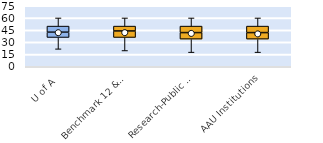
| Category | 25th | 50th | 75th |
|---|---|---|---|
| U of A | 36 | 6.5 | 7.5 |
| Benchmark 12 & SEC | 36 | 8 | 6 |
| Research-Public Univ | 34 | 8 | 8 |
| AAU Institutions | 34 | 8 | 8 |